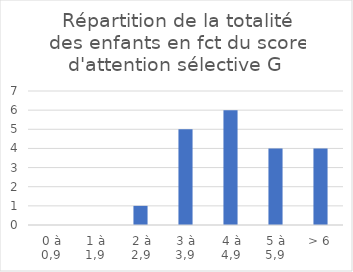
| Category | Series 0 |
|---|---|
| 0 à 0,9 | 0 |
| 1 à 1,9 | 0 |
| 2 à 2,9 | 1 |
| 3 à 3,9 | 5 |
| 4 à 4,9 | 6 |
| 5 à 5,9 | 4 |
| > 6 | 4 |